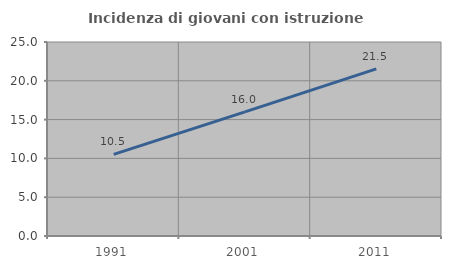
| Category | Incidenza di giovani con istruzione universitaria |
|---|---|
| 1991.0 | 10.526 |
| 2001.0 | 16 |
| 2011.0 | 21.538 |